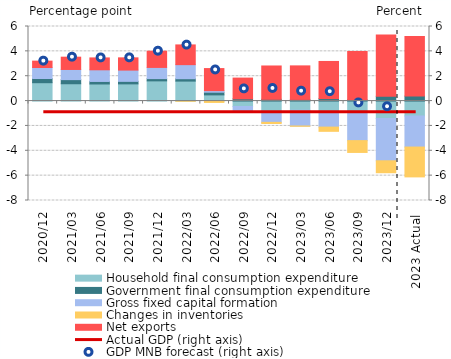
| Category | Household final consumption expenditure | Government final consumption expenditure | Gross fixed capital formation | Changes in inventories | Net exports |
|---|---|---|---|---|---|
| 2020.12 | 1.478 | 0.337 | 0.887 | 0 | 0.511 |
| 2021.03 | 1.394 | 0.332 | 0.817 | 0 | 0.989 |
| 2021.06 | 1.375 | 0.204 | 0.937 | 0 | 0.956 |
| 2021.09 | 1.383 | 0.203 | 0.907 | 0 | 0.985 |
| 2021.12 | 1.625 | 0.182 | 0.901 | 0 | 1.305 |
| 2022.03 | 1.607 | 0.192 | 1.132 | -0.015 | 1.587 |
| 2022.06 | 0.498 | 0.217 | 0.127 | -0.11 | 1.774 |
| 2022.09 | -0.439 | 0.179 | -0.43 | 0 | 1.67 |
| 2022.12 | -0.82 | 0.143 | -0.891 | -0.095 | 2.68 |
| 2023.03 | -0.741 | 0.134 | -1.266 | -0.02 | 2.697 |
| 2023.06 | -0.834 | 0.201 | -1.26 | -0.34 | 2.987 |
| 2023.09 | -0.911 | 0.096 | -2.271 | -0.951 | 3.89 |
| 2023.12 | -1.411 | 0.382 | -3.393 | -0.961 | 4.928 |
| 2023 Actual  | -1.2 | 0.4 | -2.5 | -2.4 | 4.8 |